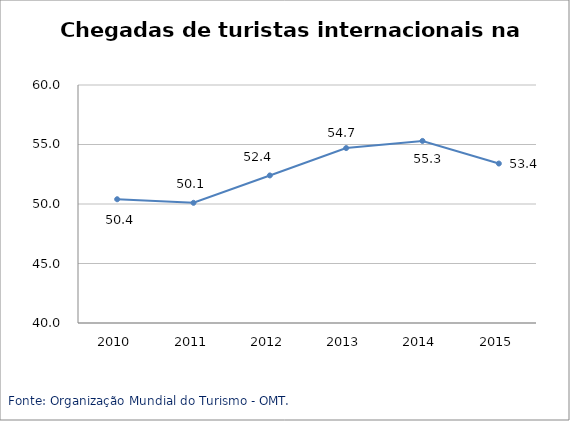
| Category | África |
|---|---|
| 2010.0 | 50.4 |
| 2011.0 | 50.1 |
| 2012.0 | 52.4 |
| 2013.0 | 54.7 |
| 2014.0 | 55.3 |
| 2015.0 | 53.4 |